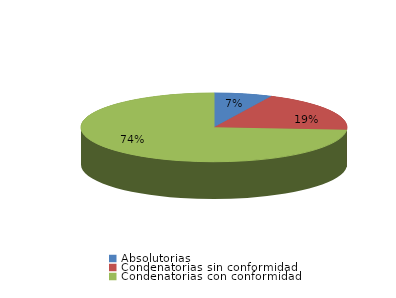
| Category | Series 0 |
|---|---|
| Absolutorias | 23 |
| Condenatorias sin conformidad | 62 |
| Condenatorias con conformidad | 240 |